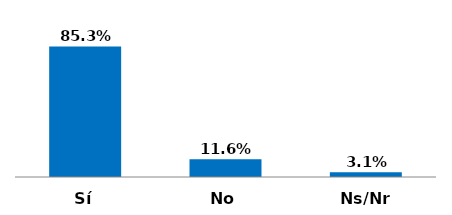
| Category | Series 0 |
|---|---|
| Sí | 0.853 |
| No | 0.116 |
| Ns/Nr | 0.031 |